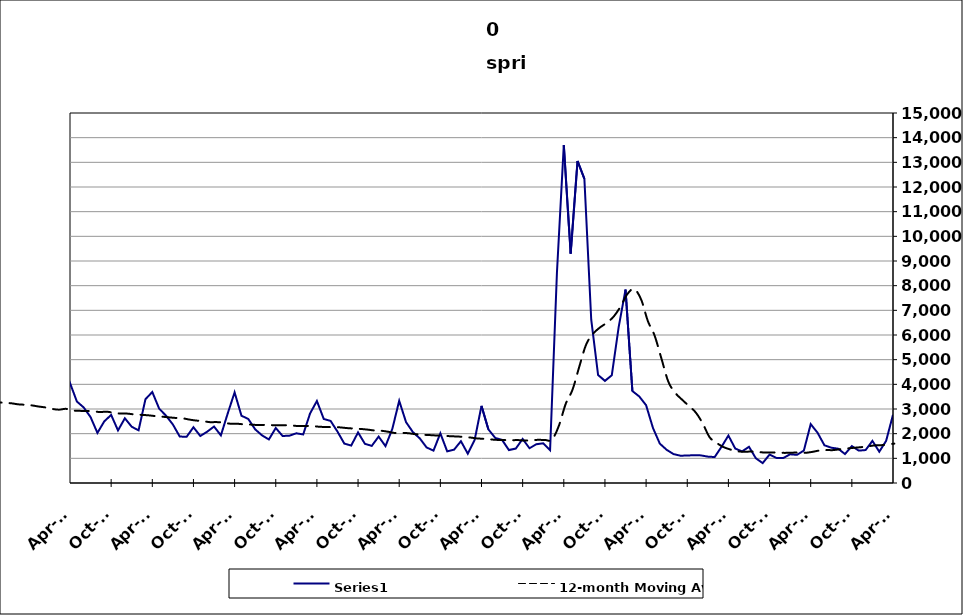
| Category | Series 0 |
|---|---|
| 2005-05-31 | 3131 |
| 2005-06-30 | 2953 |
| 2005-07-31 | 2452 |
| 2005-08-31 | 1842 |
| 2005-09-30 | 1444 |
| 2005-10-31 | 2141 |
| 2005-11-30 | 1626 |
| 2005-12-31 | 1998 |
| 2006-01-31 | 1588 |
| 2006-02-28 | 1445 |
| 2006-03-31 | 1949 |
| 2006-04-30 | 2959 |
| 2006-05-31 | 2381 |
| 2006-06-30 | 2220 |
| 2006-07-31 | 2123 |
| 2006-08-31 | 1525 |
| 2006-09-30 | 1615 |
| 2006-10-31 | 1860 |
| 2006-11-30 | 1507 |
| 2006-12-31 | 1965 |
| 2007-01-31 | 2023 |
| 2007-02-28 | 1616 |
| 2007-03-31 | 2671 |
| 2007-04-30 | 3721 |
| 2007-05-31 | 2286 |
| 2007-06-30 | 3372 |
| 2007-07-30 | 2459 |
| 2007-08-31 | 1980 |
| 2007-09-30 | 2331 |
| 2007-10-31 | 2490 |
| 2007-11-15 | 1970 |
| 2007-12-15 09:36:00 | 2318 |
| 2008-01-14 19:12:00 | 2557 |
| 2008-02-14 04:48:00 | 2676 |
| 2008-03-15 14:24:00 | 3345 |
| 2008-04-15 | 4771 |
| 2008-05-15 09:36:00 | 3529 |
| 2008-06-14 19:12:00 | 4044 |
| 2008-07-15 04:48:00 | 3468 |
| 2008-08-14 14:24:00 | 2936 |
| 2008-09-14 | 3327 |
| 2008-10-14 09:36:00 | 4398 |
| 2008-11-13 19:12:00 | 4288 |
| 2008-12-14 04:48:00 | 4919 |
| 2009-01-13 14:24:00 | 4529 |
| 2009-02-13 | 4588 |
| 2009-03-15 09:36:00 | 6230 |
| 2009-04-14 19:12:00 | 6528 |
| 2009-05-15 04:48:00 | 5710 |
| 2009-06-14 14:24:00 | 5729 |
| 2009-07-15 | 5181 |
| 2009-08-14 09:36:00 | 4471 |
| 2009-09-13 19:12:00 | 4514 |
| 2009-10-14 04:48:00 | 4928 |
| 2009-11-13 14:24:00 | 4288 |
| 2009-12-14 | 4919 |
| 2010-01-13 09:36:00 | 4406 |
| 2010-02-12 19:12:00 | 3451 |
| 2010-03-15 04:48:00 | 4910 |
| 2010-04-14 14:24:00 | 5413 |
| 2010-05-15 | 4664 |
| 2010-06-14 09:36:00 | 4652 |
| 2010-07-14 19:12:00 | 3833 |
| 2010-08-14 04:48:00 | 3333 |
| 2010-09-13 14:24:00 | 3073 |
| 2010-10-14 | 3708 |
| 2010-11-13 09:36:00 | 3510 |
| 2010-12-13 19:12:00 | 3680 |
| 2011-01-13 04:48:00 | 3314 |
| 2011-02-12 14:24:00 | 2671 |
| 2011-03-15 | 4059 |
| 2011-04-14 09:36:00 | 4574 |
| 2011-05-14 19:12:00 | 4200 |
| 2011-06-14 04:48:00 | 4010 |
| 2011-07-14 14:24:00 | 3058 |
| 2011-08-14 | 3003 |
| 2011-09-13 09:36:00 | 2938 |
| 2011-10-13 19:12:00 | 3534 |
| 2011-11-13 04:48:00 | 3132 |
| 2011-12-13 14:24:00 | 3706 |
| 2012-01-13 | 3182 |
| 2012-02-12 09:36:00 | 2802 |
| 2012-03-13 19:12:00 | 3584 |
| 2012-04-13 04:48:00 | 4909 |
| 2012-05-13 14:24:00 | 4188 |
| 2012-06-13 | 3531 |
| 2012-07-13 09:36:00 | 3044 |
| 2012-08-12 19:12:00 | 2885 |
| 2012-09-12 04:48:00 | 2556 |
| 2012-10-12 14:24:00 | 3582 |
| 2012-11-12 | 3054 |
| 2012-12-12 09:36:00 | 3117 |
| 2013-01-11 19:12:00 | 3385 |
| 2013-02-11 04:48:00 | 2732 |
| 2013-03-13 14:24:00 | 3189 |
| 2013-04-13 | 4828 |
| 2013-05-13 09:36:00 | 3513 |
| 2013-06-12 19:12:00 | 3099 |
| 2013-07-13 04:48:00 | 2867 |
| 2013-08-12 14:24:00 | 2371 |
| 2013-09-12 | 2330 |
| 2013-10-12 09:36:00 | 3301 |
| 2013-11-11 19:12:00 | 2499 |
| 2013-12-12 04:48:00 | 2658 |
| 2014-01-11 14:24:00 | 2669 |
| 2014-02-11 | 2351 |
| 2014-03-13 09:36:00 | 3592 |
| 2014-04-12 19:12:00 | 4054 |
| 2014-05-13 04:48:00 | 3305 |
| 2014-06-12 14:24:00 | 3062 |
| 2014-07-13 | 2671 |
| 2014-08-12 09:36:00 | 2031 |
| 2014-09-11 19:12:00 | 2501 |
| 2014-10-12 04:48:00 | 2759 |
| 2014-11-11 14:24:00 | 2132 |
| 2014-12-12 | 2624 |
| 2015-01-11 09:36:00 | 2280 |
| 2015-02-10 19:12:00 | 2135 |
| 2015-03-13 04:48:00 | 3396 |
| 2015-04-12 14:24:00 | 3689 |
| 2015-05-13 | 3015 |
| 2015-06-12 09:36:00 | 2729 |
| 2015-07-12 19:12:00 | 2373 |
| 2015-08-12 04:48:00 | 1884 |
| 2015-09-11 14:24:00 | 1872 |
| 2015-10-12 | 2261 |
| 2015-11-11 09:36:00 | 1906 |
| 2015-12-11 19:12:00 | 2079 |
| 2016-01-11 04:48:00 | 2289 |
| 2016-02-10 14:24:00 | 1931 |
| 2016-03-12 | 2822 |
| 2016-04-11 09:36:00 | 3674 |
| 2016-05-11 19:12:00 | 2728 |
| 2016-06-11 04:48:00 | 2594 |
| 2016-07-11 14:24:00 | 2175 |
| 2016-08-11 | 1931 |
| 2016-09-10 09:36:00 | 1765 |
| 2016-10-10 19:12:00 | 2230 |
| 2016-11-10 04:48:00 | 1905 |
| 2016-12-10 14:24:00 | 1919 |
| 2017-01-10 | 2015 |
| 2017-02-09 09:36:00 | 1968 |
| 2017-03-11 19:12:00 | 2817 |
| 2017-04-11 04:48:00 | 3325 |
| 2017-05-11 14:24:00 | 2596 |
| 2017-06-11 | 2516 |
| 2017-07-11 09:36:00 | 2084 |
| 2017-08-10 19:12:00 | 1597 |
| 2017-09-10 04:48:00 | 1518 |
| 2017-10-10 14:24:00 | 2050 |
| 2017-11-10 | 1589 |
| 2017-12-10 09:36:00 | 1505 |
| 2018-01-09 19:12:00 | 1882 |
| 2018-02-09 04:48:00 | 1495 |
| 2018-03-11 14:24:00 | 2194 |
| 2018-04-11 | 3332 |
| 2018-05-11 09:36:00 | 2466 |
| 2018-06-10 19:12:00 | 2063 |
| 2018-07-11 04:48:00 | 1809 |
| 2018-08-10 14:24:00 | 1440 |
| 2018-09-10 | 1313 |
| 2018-10-10 09:36:00 | 2015 |
| 2018-11-09 19:12:00 | 1282 |
| 2018-12-10 04:48:00 | 1351 |
| 2019-01-09 14:24:00 | 1695 |
| 2019-02-09 | 1189 |
| 2019-03-11 09:36:00 | 1746 |
| 2019-04-10 19:12:00 | 3126 |
| 2019-05-11 04:48:00 | 2174 |
| 2019-06-10 14:24:00 | 1827 |
| 2019-07-11 | 1744 |
| 2019-08-10 09:36:00 | 1335 |
| 2019-09-09 19:12:00 | 1398 |
| 2019-10-10 04:48:00 | 1790 |
| 2019-11-09 14:24:00 | 1407 |
| 2019-12-10 | 1573 |
| 2020-01-09 09:36:00 | 1610 |
| 2020-02-08 19:12:00 | 1333 |
| 2020-03-10 04:48:00 | 8532 |
| 2020-04-09 14:24:00 | 13699 |
| 2020-05-10 | 9300 |
| 2020-06-09 09:36:00 | 13055 |
| 2020-07-09 19:12:00 | 12333 |
| 2020-08-09 04:48:00 | 6620 |
| 2020-09-08 14:24:00 | 4377 |
| 2020-10-09 | 4142 |
| 2020-11-08 09:36:00 | 4370 |
| 2020-12-08 19:12:00 | 6320 |
| 2021-01-08 04:48:00 | 7842 |
| 2021-02-07 14:24:00 | 3728 |
| 2021-03-10 | 3509 |
| 2021-04-09 09:36:00 | 3153 |
| 2021-05-09 19:12:00 | 2232 |
| 2021-06-09 04:48:00 | 1596 |
| 2021-07-09 14:24:00 | 1345 |
| 2021-08-09 | 1172 |
| 2021-09-08 09:36:00 | 1107 |
| 2021-10-08 19:12:00 | 1113 |
| 2021-11-08 04:48:00 | 1129 |
| 2021-12-08 14:24:00 | 1119 |
| 2022-01-08 | 1069 |
| 2022-02-07 09:36:00 | 1053 |
| 2022-03-09 19:12:00 | 1468 |
| 2022-04-09 04:48:00 | 1924 |
| 2022-05-09 14:24:00 | 1396 |
| 2022-06-09 | 1281 |
| 2022-07-09 09:36:00 | 1468 |
| 2022-08-08 19:12:00 | 1003 |
| 2022-09-08 04:48:00 | 806 |
| 2022-10-08 14:24:00 | 1152 |
| 2022-11-08 | 1018 |
| 2022-12-08 09:36:00 | 1012 |
| 2023-01-07 19:12:00 | 1164 |
| 2023-02-07 04:48:00 | 1142 |
| 2023-03-09 14:24:00 | 1314 |
| 2023-04-09 | 2387 |
| 2023-05-09 09:36:00 | 2037 |
| 2023-06-08 19:12:00 | 1530 |
| 2023-07-09 04:48:00 | 1431 |
| 2023-08-08 14:24:00 | 1391 |
| 2023-09-08 | 1174 |
| 2023-10-08 09:36:00 | 1496 |
| 2023-11-07 19:12:00 | 1313 |
| 2023-12-08 04:48:00 | 1335 |
| 2024-01-07 14:24:00 | 1707 |
| 2024-02-07 | 1268 |
| 2024-03-08 09:36:00 | 1709 |
| 2024-04-07 19:12:00 | 2766 |